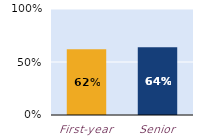
| Category | substantially |
|---|---|
| First-year | 0.621 |
| Senior | 0.64 |